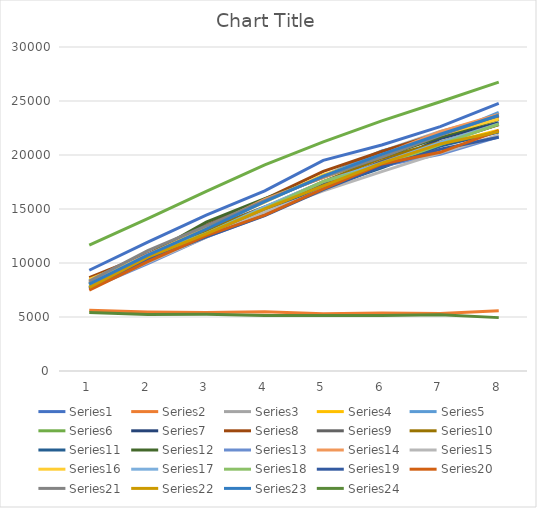
| Category | Series 0 | Series 1 | Series 2 | Series 3 | Series 4 | Series 5 | Series 6 | Series 7 | Series 8 | Series 9 | Series 10 | Series 11 | Series 12 | Series 13 | Series 14 | Series 15 | Series 16 | Series 17 | Series 18 | Series 19 | Series 20 | Series 21 | Series 22 | Series 23 |
|---|---|---|---|---|---|---|---|---|---|---|---|---|---|---|---|---|---|---|---|---|---|---|---|---|
| 0 | 9330 | 5616 | 8259 | 7851 | 8351 | 11647 | 8082 | 8651 | 8189 | 7987 | 7750 | 8036 | 7620 | 8271 | 7665 | 8489 | 7998 | 7749 | 7615 | 7484 | 8315 | 7739 | 8040 | 5424 |
| 1 | 11942 | 5472 | 10830 | 10276 | 10854 | 14117 | 10517 | 10809 | 10790 | 10448 | 10177 | 10725 | 9933 | 10784 | 10069 | 10662 | 10763 | 10641 | 10288 | 10121 | 11148 | 10546 | 10731 | 5243 |
| 2 | 14433 | 5413 | 13217 | 12971 | 13166 | 16624 | 13054 | 13476 | 13106 | 13011 | 12523 | 13782 | 12402 | 13228 | 12402 | 13276 | 12726 | 12741 | 12425 | 12528 | 13435 | 12697 | 13134 | 5252 |
| 3 | 16684 | 5477 | 15750 | 14978 | 15756 | 19080 | 14943 | 15913 | 15196 | 15155 | 14762 | 15962 | 14425 | 15891 | 14734 | 15629 | 15192 | 15047 | 14396 | 14436 | 15772 | 15015 | 15690 | 5149 |
| 4 | 19503 | 5295 | 17998 | 17090 | 18053 | 21216 | 17406 | 18483 | 17208 | 17530 | 16932 | 17922 | 16913 | 17919 | 16687 | 18162 | 17536 | 17543 | 16786 | 16858 | 17970 | 17135 | 18039 | 5132 |
| 5 | 20926 | 5376 | 20328 | 19368 | 20383 | 23159 | 18988 | 20324 | 19429 | 19703 | 18812 | 19840 | 18983 | 19991 | 18454 | 19863 | 19263 | 19032 | 18937 | 19168 | 19805 | 19243 | 20052 | 5134 |
| 6 | 22628 | 5328 | 22187 | 20940 | 21688 | 24935 | 21525 | 22023 | 21081 | 21197 | 20819 | 21665 | 20068 | 22153 | 20196 | 21881 | 21174 | 20969 | 20534 | 20246 | 21824 | 21024 | 21919 | 5213 |
| 7 | 24772 | 5590 | 23616 | 22303 | 23957 | 26744 | 22983 | 23608 | 22813 | 22824 | 22127 | 23302 | 21686 | 23763 | 21833 | 23329 | 22880 | 22859 | 21646 | 22255 | 23698 | 22164 | 23657 | 4942 |